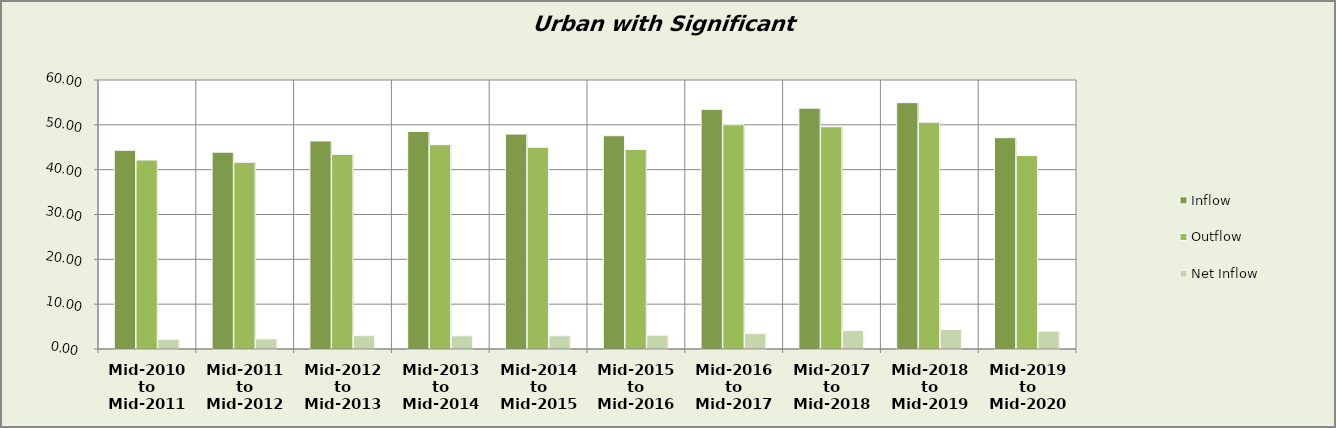
| Category | Inflow | Outflow | Net Inflow |
|---|---|---|---|
| Mid-2010 to Mid-2011 | 44.313 | 42.148 | 2.165 |
| Mid-2011 to Mid-2012 | 43.895 | 41.636 | 2.259 |
| Mid-2012 to Mid-2013 | 46.388 | 43.413 | 2.975 |
| Mid-2013 to Mid-2014 | 48.516 | 45.58 | 2.936 |
| Mid-2014 to Mid-2015 | 47.93 | 44.992 | 2.938 |
| Mid-2015 to Mid-2016 | 47.573 | 44.498 | 3.075 |
| Mid-2016 to Mid-2017 | 53.449 | 50.014 | 3.435 |
| Mid-2017 to Mid-2018 | 53.714 | 49.566 | 4.148 |
| Mid-2018 to Mid-2019 | 54.943 | 50.582 | 4.361 |
| Mid-2019 to Mid-2020 | 47.131 | 43.148 | 3.984 |